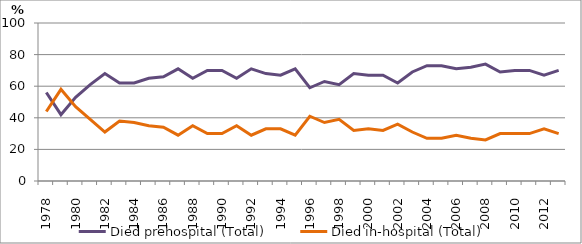
| Category | Died prehospital (Total) | Died in-hospital (Total) |
|---|---|---|
| 1978.0 | 56 | 44 |
| 1979.0 | 42 | 58 |
| 1980.0 | 53 | 47 |
| 1981.0 | 61 | 39 |
| 1982.0 | 68 | 31 |
| 1983.0 | 62 | 38 |
| 1984.0 | 62 | 37 |
| 1985.0 | 65 | 35 |
| 1986.0 | 66 | 34 |
| 1987.0 | 71 | 29 |
| 1988.0 | 65 | 35 |
| 1989.0 | 70 | 30 |
| 1990.0 | 70 | 30 |
| 1991.0 | 65 | 35 |
| 1992.0 | 71 | 29 |
| 1993.0 | 68 | 33 |
| 1994.0 | 67 | 33 |
| 1995.0 | 71 | 29 |
| 1996.0 | 59 | 41 |
| 1997.0 | 63 | 37 |
| 1998.0 | 61 | 39 |
| 1999.0 | 68 | 32 |
| 2000.0 | 67 | 33 |
| 2001.0 | 67 | 32 |
| 2002.0 | 62 | 36 |
| 2003.0 | 69 | 31 |
| 2004.0 | 73 | 27 |
| 2005.0 | 73 | 27 |
| 2006.0 | 71 | 29 |
| 2007.0 | 72 | 27 |
| 2008.0 | 74 | 26 |
| 2009.0 | 69 | 30 |
| 2010.0 | 70 | 30 |
| 2011.0 | 70 | 30 |
| 2012.0 | 67 | 33 |
| 2013.0 | 70 | 30 |